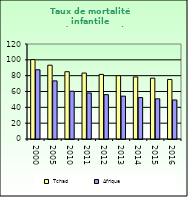
| Category | Tchad | Afrique                        |
|---|---|---|
| 2000.0 | 100.3 | 87.462 |
| 2005.0 | 93.2 | 73.418 |
| 2010.0 | 85 | 60.345 |
| 2011.0 | 83.3 | 58.107 |
| 2012.0 | 81.6 | 56.032 |
| 2013.0 | 80 | 54.131 |
| 2014.0 | 78.4 | 52.336 |
| 2015.0 | 76.8 | 50.754 |
| 2016.0 | 75.2 | 49.283 |